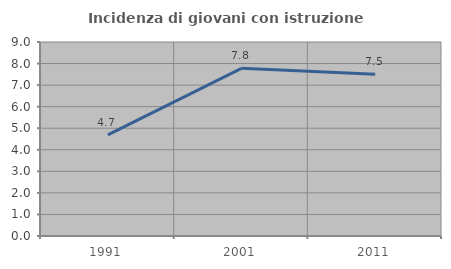
| Category | Incidenza di giovani con istruzione universitaria |
|---|---|
| 1991.0 | 4.688 |
| 2001.0 | 7.778 |
| 2011.0 | 7.5 |